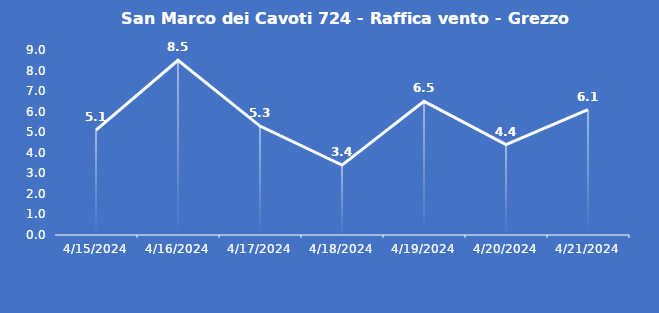
| Category | San Marco dei Cavoti 724 - Raffica vento - Grezzo (m/s) |
|---|---|
| 4/15/24 | 5.1 |
| 4/16/24 | 8.5 |
| 4/17/24 | 5.3 |
| 4/18/24 | 3.4 |
| 4/19/24 | 6.5 |
| 4/20/24 | 4.4 |
| 4/21/24 | 6.1 |